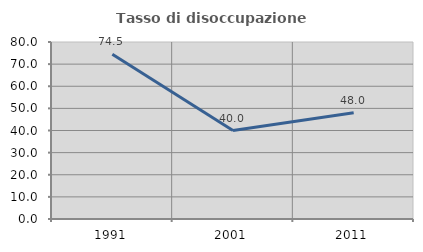
| Category | Tasso di disoccupazione giovanile  |
|---|---|
| 1991.0 | 74.51 |
| 2001.0 | 40 |
| 2011.0 | 48 |